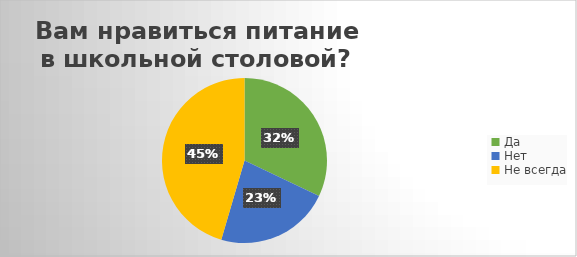
| Category | Series 0 |
|---|---|
| Да | 67 |
| Нет | 47 |
| Не всегда | 95 |